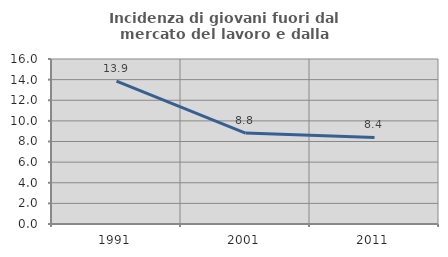
| Category | Incidenza di giovani fuori dal mercato del lavoro e dalla formazione  |
|---|---|
| 1991.0 | 13.86 |
| 2001.0 | 8.818 |
| 2011.0 | 8.39 |